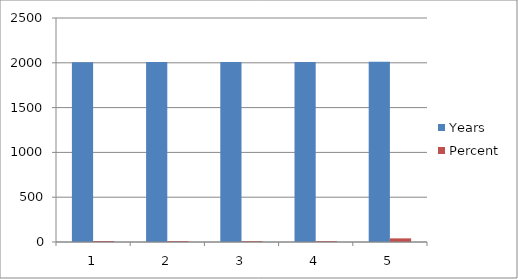
| Category | Years | Percent |
|---|---|---|
| 0 | 2007 | 11.24 |
| 1 | 2008 | 10.08 |
| 2 | 2009 | 9.88 |
| 3 | 2010 | 9.67 |
| 4 | 2011 | 40.6 |